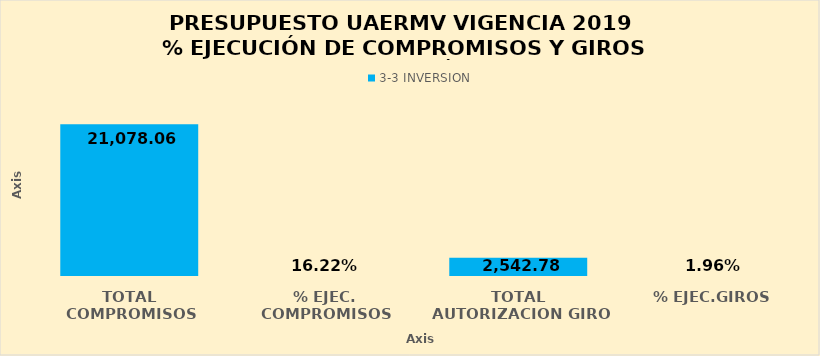
| Category | #REF! | 3-3 |
|---|---|---|
| TOTAL COMPROMISOS |  | 21078.055 |
| % EJEC. COMPROMISOS |  | 0.162 |
| TOTAL AUTORIZACION GIRO |  | 2542.775 |
| % EJEC.GIROS |  | 0.02 |